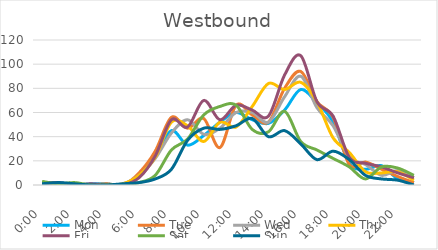
| Category | Mon | Tue | Wed | Thu | Fri | Sat | Sun |
|---|---|---|---|---|---|---|---|
| 0.0 | 1 | 1 | 1 | 2 | 1 | 3 | 1 |
| 0.041667 | 2 | 0 | 1 | 1 | 2 | 1 | 2 |
| 0.083333 | 0 | 0 | 0 | 0 | 0 | 2 | 1 |
| 0.125 | 1 | 0 | 0 | 0 | 1 | 0 | 0 |
| 0.166667 | 1 | 1 | 0 | 0 | 0 | 0 | 0 |
| 0.208333 | 0 | 0 | 1 | 1 | 0 | 0 | 1 |
| 0.25 | 8 | 10 | 8 | 8 | 6 | 2 | 2 |
| 0.291667 | 24 | 28 | 22 | 23 | 24 | 8 | 5 |
| 0.333333 | 45 | 56 | 43 | 52 | 54 | 29 | 13 |
| 0.375 | 33 | 47 | 54 | 49 | 48 | 38 | 37 |
| 0.416667 | 41 | 55 | 42 | 36 | 70 | 58 | 47 |
| 0.458333 | 52 | 31 | 47 | 52 | 54 | 65 | 46 |
| 0.5 | 60 | 66 | 60 | 48 | 66 | 66 | 49 |
| 0.541667 | 54 | 58 | 60 | 65 | 62 | 46 | 55 |
| 0.5833333333333334 | 51 | 52 | 52 | 84 | 57 | 44 | 40 |
| 0.625 | 62 | 80 | 73 | 79 | 91 | 61 | 45 |
| 0.666667 | 79 | 94 | 90 | 85 | 107 | 36 | 34 |
| 0.708333 | 68 | 69 | 64 | 69 | 69 | 29 | 21 |
| 0.75 | 52 | 56 | 49 | 39 | 57 | 22 | 28 |
| 0.791667 | 18 | 17 | 23 | 27 | 23 | 15 | 21 |
| 0.833333 | 13 | 19 | 17 | 11 | 18 | 5 | 8 |
| 0.875 | 16 | 13 | 8 | 10 | 15 | 15 | 5 |
| 0.916667 | 5 | 7 | 12 | 11 | 10 | 14 | 4 |
| 0.958333 | 2 | 2 | 6 | 4 | 6 | 8 | 0 |